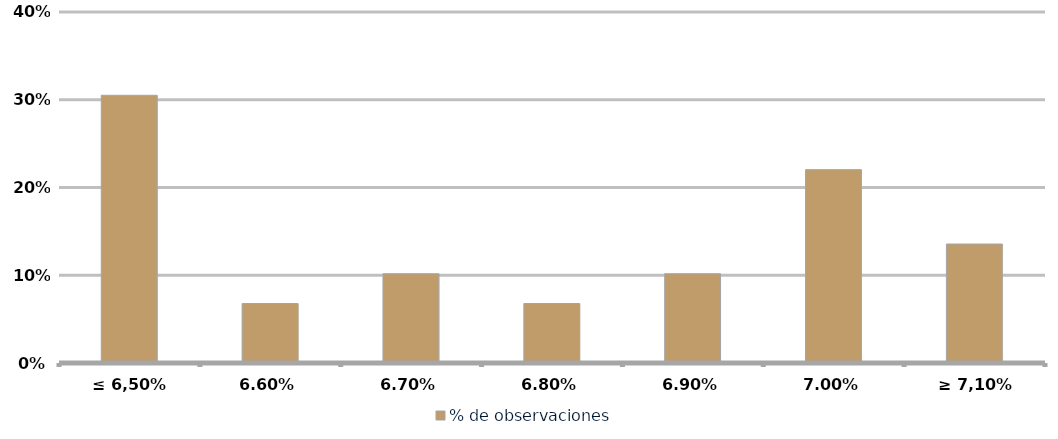
| Category | % de observaciones  |
|---|---|
| ≤ 6,50% | 0.305 |
| 6,60% | 0.068 |
| 6,70% | 0.102 |
| 6,80% | 0.068 |
| 6,90% | 0.102 |
| 7,00% | 0.22 |
| ≥ 7,10% | 0.136 |